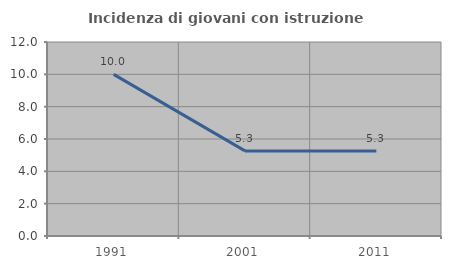
| Category | Incidenza di giovani con istruzione universitaria |
|---|---|
| 1991.0 | 10 |
| 2001.0 | 5.263 |
| 2011.0 | 5.263 |